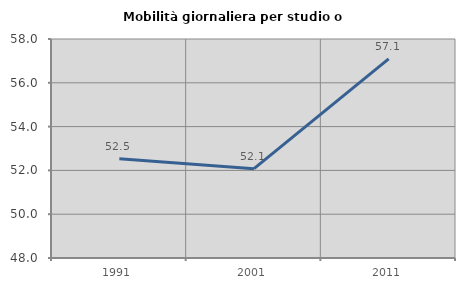
| Category | Mobilità giornaliera per studio o lavoro |
|---|---|
| 1991.0 | 52.534 |
| 2001.0 | 52.078 |
| 2011.0 | 57.095 |